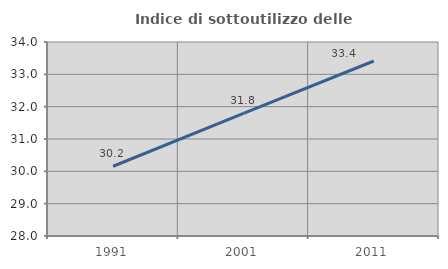
| Category | Indice di sottoutilizzo delle abitazioni  |
|---|---|
| 1991.0 | 30.157 |
| 2001.0 | 31.795 |
| 2011.0 | 33.413 |